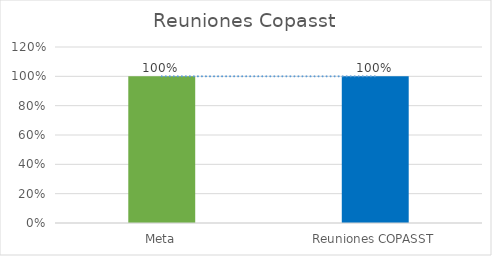
| Category | Series 0 |
|---|---|
| Meta | 1 |
| Reuniones COPASST | 1 |